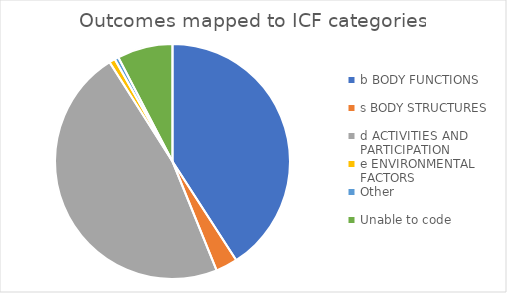
| Category | Series 0 |
|---|---|
| b BODY FUNCTIONS | 40.872 |
| s BODY STRUCTURES | 2.997 |
| d ACTIVITIES AND PARTICIPATION | 47.139 |
| e ENVIRONMENTAL FACTORS | 0.817 |
| Other | 0.545 |
| Unable to code | 7.629 |